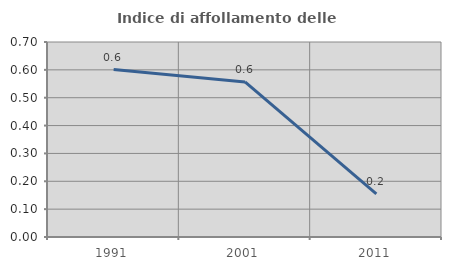
| Category | Indice di affollamento delle abitazioni  |
|---|---|
| 1991.0 | 0.601 |
| 2001.0 | 0.557 |
| 2011.0 | 0.155 |